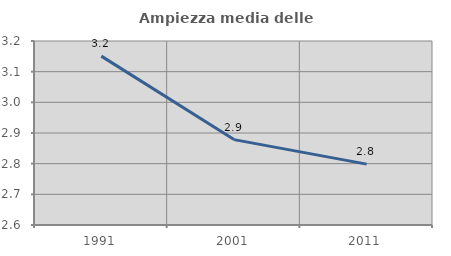
| Category | Ampiezza media delle famiglie |
|---|---|
| 1991.0 | 3.151 |
| 2001.0 | 2.878 |
| 2011.0 | 2.798 |